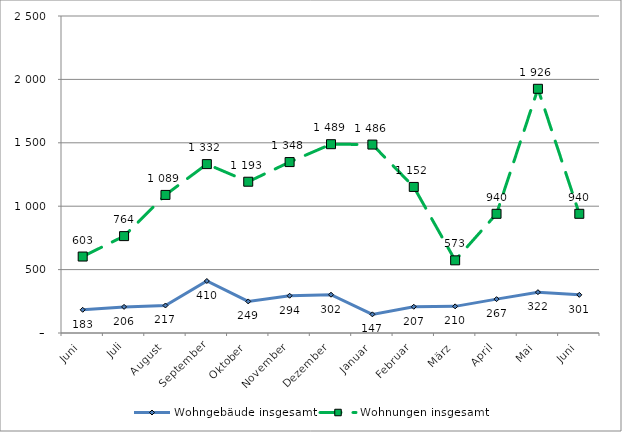
| Category | Wohngebäude insgesamt | Wohnungen insgesamt |
|---|---|---|
| Juni | 183 | 603 |
| Juli | 206 | 764 |
| August | 217 | 1089 |
| September | 410 | 1332 |
| Oktober | 249 | 1193 |
| November | 294 | 1348 |
| Dezember | 302 | 1489 |
| Januar | 147 | 1486 |
| Februar | 207 | 1152 |
| März | 210 | 573 |
| April | 267 | 940 |
| Mai | 322 | 1926 |
| Juni | 301 | 940 |